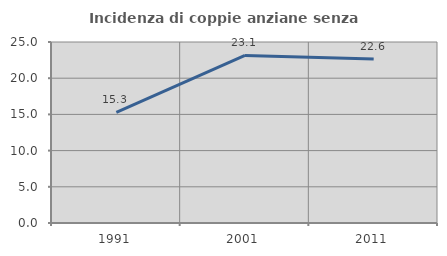
| Category | Incidenza di coppie anziane senza figli  |
|---|---|
| 1991.0 | 15.267 |
| 2001.0 | 23.148 |
| 2011.0 | 22.642 |